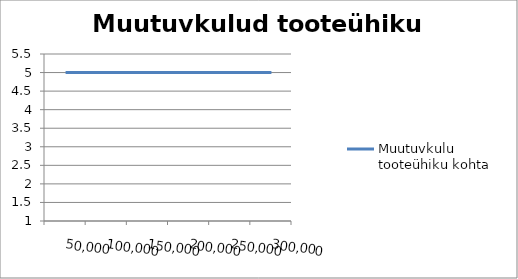
| Category | Muutuvkulu tooteühiku kohta |
|---|---|
| 50000.0 | 5 |
| 100000.0 | 5 |
| 150000.0 | 5 |
| 200000.0 | 5 |
| 250000.0 | 5 |
| 300000.0 | 5 |